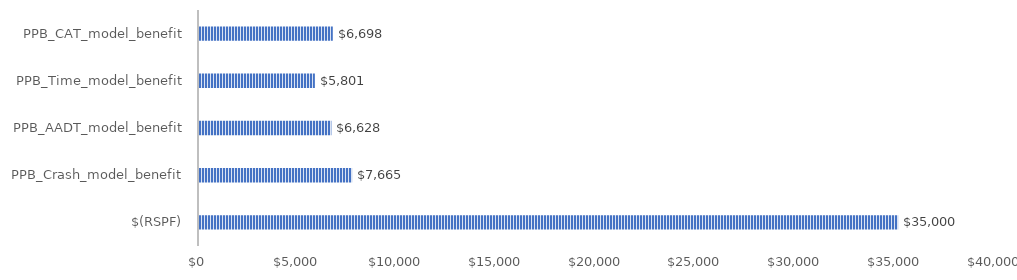
| Category | Series 0 |
|---|---|
| $(RSPF) | 35000 |
| PPB_Crash_model_benefit | 7665 |
| PPB_AADT_model_benefit | 6628.125 |
| PPB_Time_model_benefit | 5801.25 |
| PPB_CAT_model_benefit | 6698.125 |